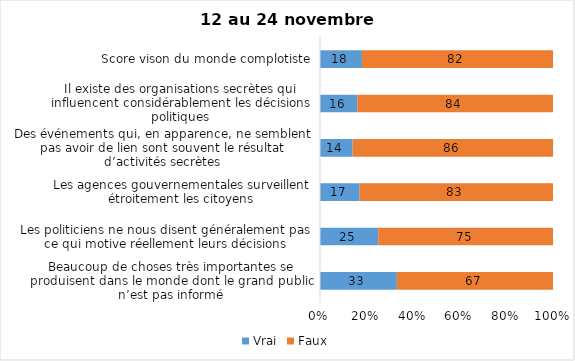
| Category | Vrai | Faux |
|---|---|---|
| Beaucoup de choses très importantes se produisent dans le monde dont le grand public n’est pas informé | 33 | 67 |
| Les politiciens ne nous disent généralement pas ce qui motive réellement leurs décisions | 25 | 75 |
| Les agences gouvernementales surveillent étroitement les citoyens | 17 | 83 |
| Des événements qui, en apparence, ne semblent pas avoir de lien sont souvent le résultat d’activités secrètes | 14 | 86 |
| Il existe des organisations secrètes qui influencent considérablement les décisions politiques | 16 | 84 |
| Score vison du monde complotiste | 18 | 82 |